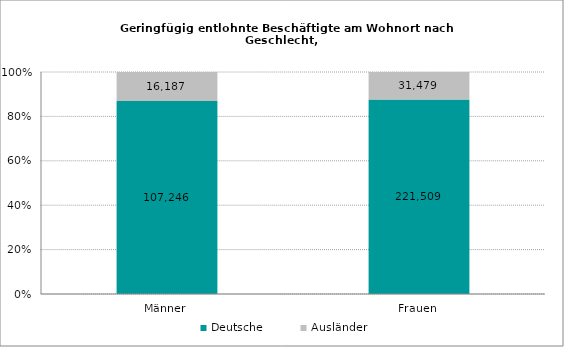
| Category | Deutsche | Ausländer |
|---|---|---|
| Männer | 107246 | 16187 |
| Frauen | 221509 | 31479 |